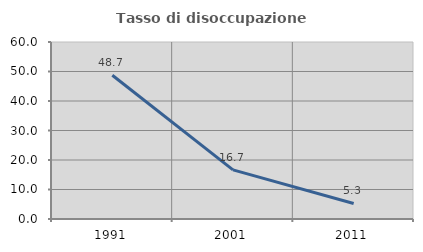
| Category | Tasso di disoccupazione giovanile  |
|---|---|
| 1991.0 | 48.718 |
| 2001.0 | 16.667 |
| 2011.0 | 5.263 |